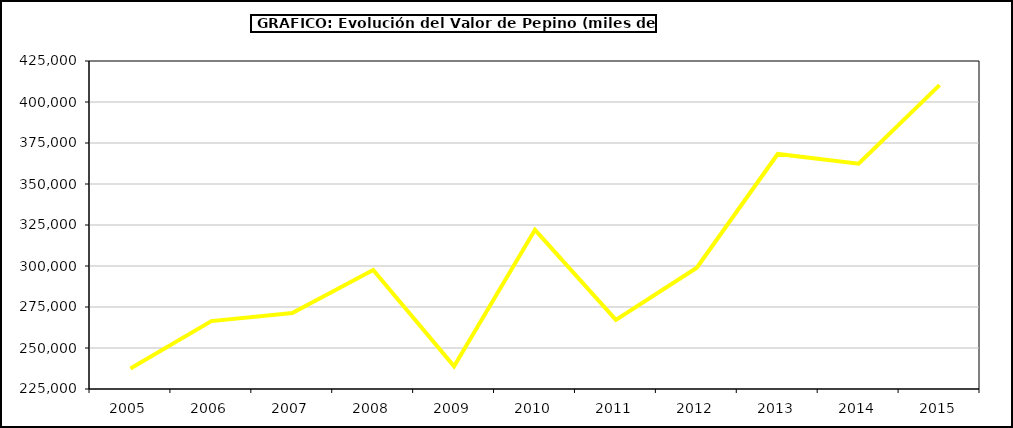
| Category | Valor |
|---|---|
| 2005.0 | 237474 |
| 2006.0 | 266388.934 |
| 2007.0 | 271361.535 |
| 2008.0 | 297618.944 |
| 2009.0 | 238895.627 |
| 2010.0 | 322047.392 |
| 2011.0 | 267189.859 |
| 2012.0 | 298950.9 |
| 2013.0 | 368300.179 |
| 2014.0 | 362347 |
| 2015.0 | 410299 |